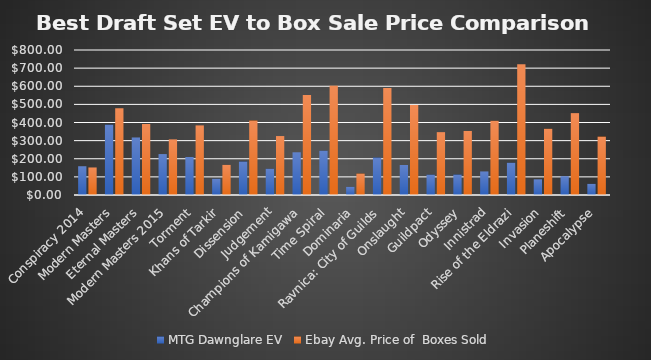
| Category | MTG Dawnglare EV | Ebay Avg. Price of  Boxes Sold |
|---|---|---|
| Conspiracy 2014 | 158.72 | 151.899 |
| Modern Masters | 387.9 | 478.458 |
| Eternal Masters | 317.4 | 391.602 |
| Modern Masters 2015 | 225.85 | 306.952 |
| Torment | 209.54 | 383.983 |
| Khans of Tarkir | 89.41 | 166.094 |
| Dissension | 184.5 | 410.988 |
| Judgement | 144.66 | 325.196 |
| Champions of Kamigawa | 235.68 | 551.95 |
| Time Spiral | 244.17 | 603.088 |
| Dominaria | 44.78 | 118.124 |
| Ravnica: City of Guilds | 206.59 | 590.787 |
| Onslaught | 165.65 | 496.82 |
| Guildpact | 112.06 | 346.8 |
| Odyssey | 112.83 | 353.334 |
| Innistrad | 130.01 | 409.278 |
| Rise of the Eldrazi | 177.79 | 722.015 |
| Invasion | 86.49 | 365.21 |
| Planeshift | 103.66 | 451.653 |
| Apocalypse | 61.4 | 322.177 |